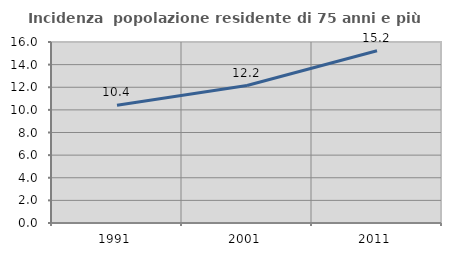
| Category | Incidenza  popolazione residente di 75 anni e più |
|---|---|
| 1991.0 | 10.406 |
| 2001.0 | 12.151 |
| 2011.0 | 15.22 |